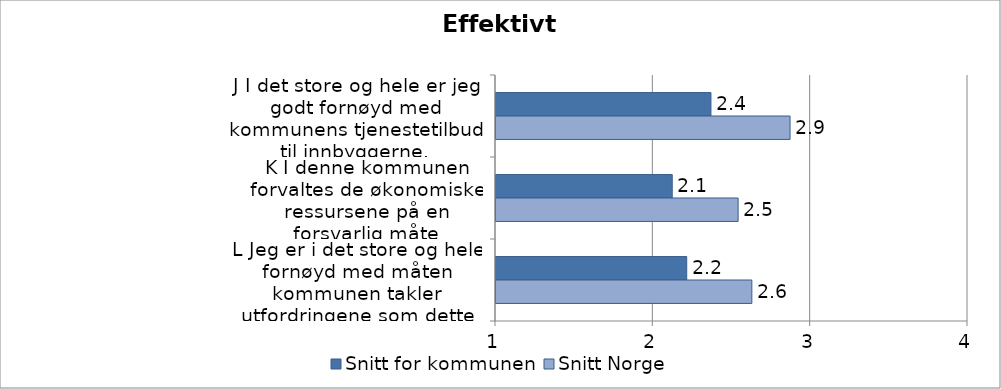
| Category | Snitt for kommunen | Snitt Norge |
|---|---|---|
| J I det store og hele er jeg godt fornøyd med kommunens tjenestetilbud til innbyggerne. | 2.366 | 2.869 |
| K I denne kommunen forvaltes de økonomiske ressursene på en forsvarlig måte | 2.12 | 2.539 |
| L Jeg er i det store og hele fornøyd med måten kommunen takler utfordringene som dette lokalsamfunnet står overfor | 2.212 | 2.626 |